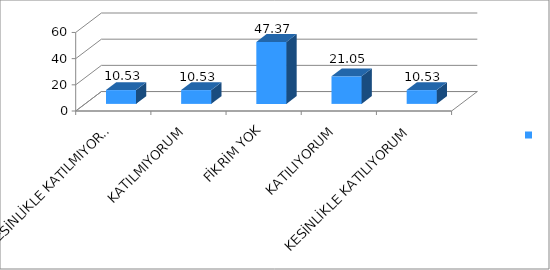
| Category | Series 0 |
|---|---|
| KESİNLİKLE KATILMIYORUM | 10.53 |
| KATILMIYORUM | 10.53 |
| FİKRİM YOK | 47.37 |
| KATILIYORUM | 21.05 |
| KESİNLİKLE KATILIYORUM | 10.53 |